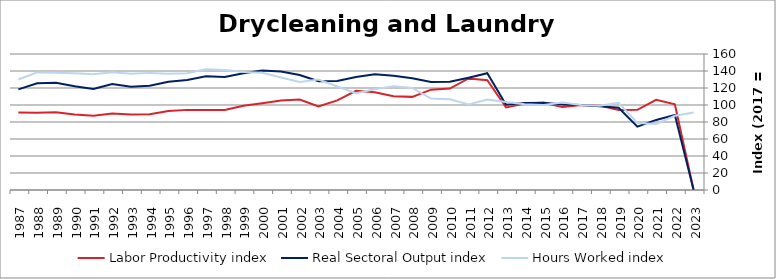
| Category | Labor Productivity index | Real Sectoral Output index | Hours Worked index |
|---|---|---|---|
| 2023.0 | 0 | 0 | 91.05 |
| 2022.0 | 100.897 | 88.175 | 87.392 |
| 2021.0 | 106.056 | 82.431 | 77.724 |
| 2020.0 | 94.39 | 74.46 | 78.885 |
| 2019.0 | 94.232 | 96.689 | 102.607 |
| 2018.0 | 99.268 | 98.449 | 99.175 |
| 2017.0 | 100 | 100 | 100 |
| 2016.0 | 97.524 | 100.519 | 103.071 |
| 2015.0 | 102.762 | 102.682 | 99.922 |
| 2014.0 | 101.697 | 102.497 | 100.787 |
| 2013.0 | 97.101 | 100.412 | 103.41 |
| 2012.0 | 129.208 | 137.437 | 106.369 |
| 2011.0 | 131.263 | 132.158 | 100.682 |
| 2010.0 | 119.314 | 127.344 | 106.73 |
| 2009.0 | 118.065 | 126.941 | 107.518 |
| 2008.0 | 109.565 | 131.51 | 120.029 |
| 2007.0 | 110.26 | 134.431 | 121.923 |
| 2006.0 | 114.946 | 136.187 | 118.479 |
| 2005.0 | 116.773 | 132.901 | 113.811 |
| 2004.0 | 105.457 | 128.346 | 121.704 |
| 2003.0 | 98.38 | 127.962 | 130.069 |
| 2002.0 | 106.465 | 135.323 | 127.105 |
| 2001.0 | 105.323 | 139.373 | 132.33 |
| 2000.0 | 102.056 | 140.642 | 137.809 |
| 1999.0 | 99.057 | 137.448 | 138.757 |
| 1998.0 | 94.22 | 132.886 | 141.038 |
| 1997.0 | 94.233 | 133.813 | 142.003 |
| 1996.0 | 94.263 | 129.527 | 137.411 |
| 1995.0 | 92.951 | 127.237 | 136.885 |
| 1994.0 | 89.067 | 122.728 | 137.793 |
| 1993.0 | 88.846 | 121.53 | 136.787 |
| 1992.0 | 89.939 | 124.707 | 138.657 |
| 1991.0 | 87.255 | 118.827 | 136.184 |
| 1990.0 | 88.901 | 122.073 | 137.314 |
| 1989.0 | 91.52 | 126.156 | 137.846 |
| 1988.0 | 90.769 | 125.547 | 138.314 |
| 1987.0 | 91.093 | 118.403 | 129.981 |